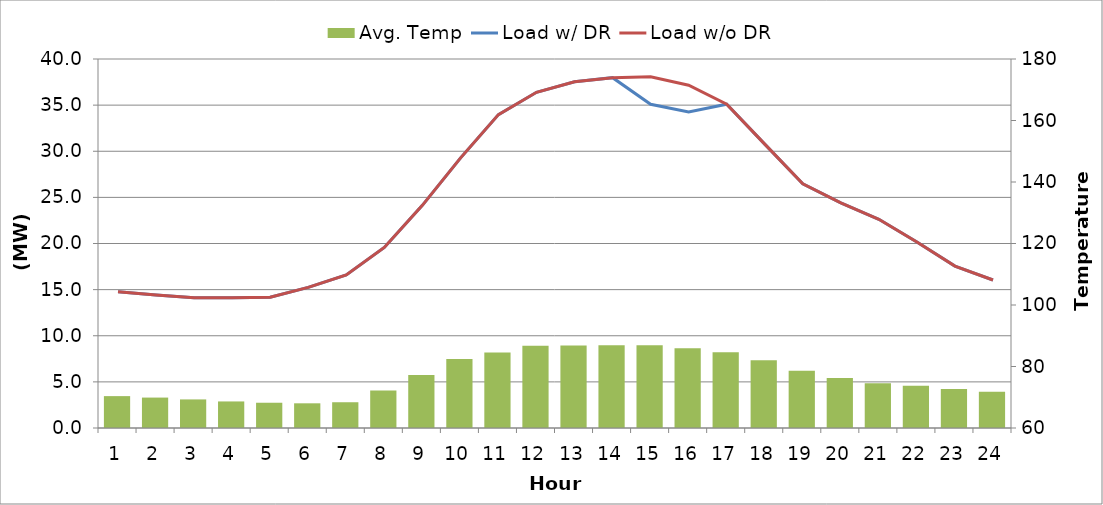
| Category | Avg. Temp |
|---|---|
| 0 | 70.368 |
| 1 | 69.894 |
| 2 | 69.294 |
| 3 | 68.636 |
| 4 | 68.214 |
| 5 | 68.03 |
| 6 | 68.377 |
| 7 | 72.222 |
| 8 | 77.233 |
| 9 | 82.466 |
| 10 | 84.524 |
| 11 | 86.712 |
| 12 | 86.8 |
| 13 | 86.902 |
| 14 | 86.94 |
| 15 | 85.916 |
| 16 | 84.604 |
| 17 | 82.066 |
| 18 | 78.6 |
| 19 | 76.288 |
| 20 | 74.522 |
| 21 | 73.771 |
| 22 | 72.67 |
| 23 | 71.774 |